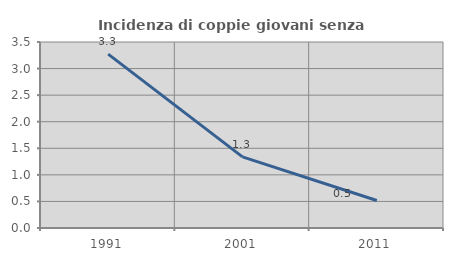
| Category | Incidenza di coppie giovani senza figli |
|---|---|
| 1991.0 | 3.273 |
| 2001.0 | 1.339 |
| 2011.0 | 0.518 |